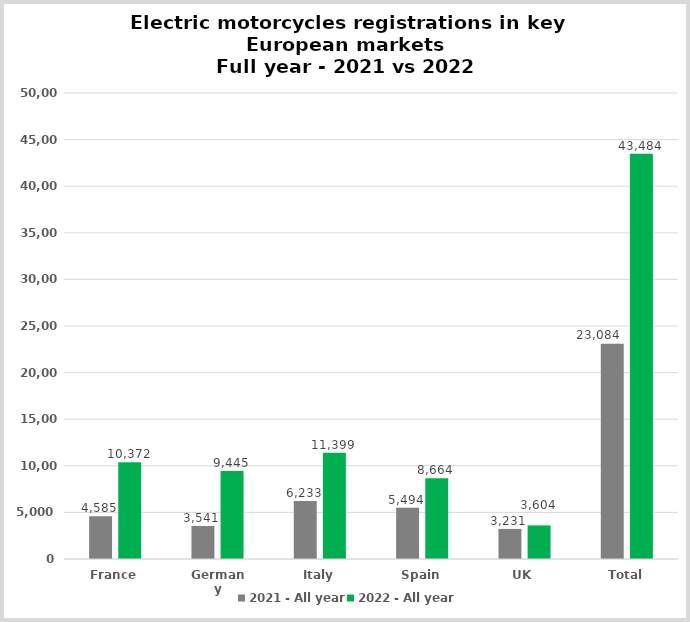
| Category | 2021 - All year | 2022 - All year |
|---|---|---|
| France | 4585 | 10372 |
| Germany | 3541 | 9445 |
| Italy | 6233 | 11399 |
| Spain | 5494 | 8664 |
| UK | 3231 | 3604 |
| Total | 23084 | 43484 |